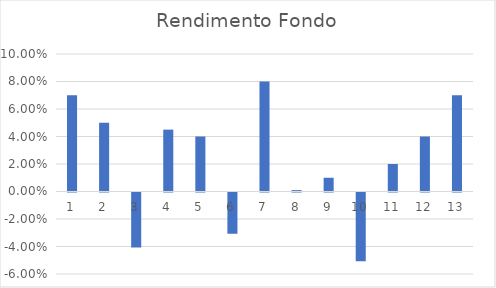
| Category | Series 0 |
|---|---|
| 1.0 | 0.07 |
| 2.0 | 0.05 |
| 3.0 | -0.04 |
| 4.0 | 0.045 |
| 5.0 | 0.04 |
| 6.0 | -0.03 |
| 7.0 | 0.08 |
| 8.0 | 0.001 |
| 9.0 | 0.01 |
| 10.0 | -0.05 |
| 11.0 | 0.02 |
| 12.0 | 0.04 |
| 13.0 | 0.07 |